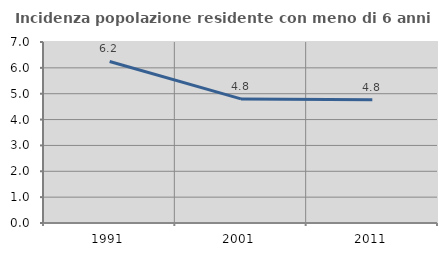
| Category | Incidenza popolazione residente con meno di 6 anni |
|---|---|
| 1991.0 | 6.248 |
| 2001.0 | 4.8 |
| 2011.0 | 4.768 |